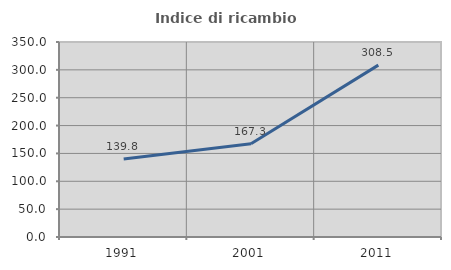
| Category | Indice di ricambio occupazionale  |
|---|---|
| 1991.0 | 139.82 |
| 2001.0 | 167.3 |
| 2011.0 | 308.523 |